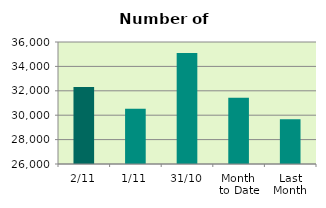
| Category | Series 0 |
|---|---|
| 2/11 | 32314 |
| 1/11 | 30538 |
| 31/10 | 35096 |
| Month 
to Date | 31426 |
| Last
Month | 29672.087 |